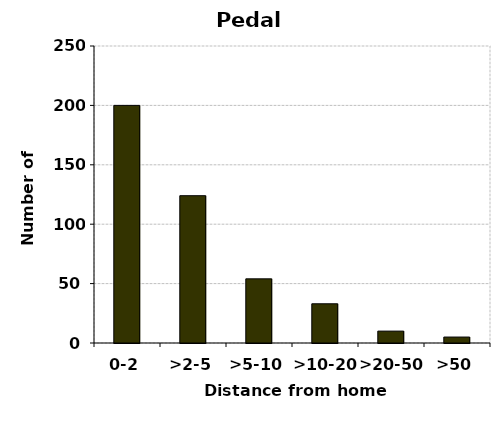
| Category | Pedal cycles |
|---|---|
| 0-2 | 200 |
| >2-5 | 124 |
| >5-10 | 54 |
| >10-20 | 33 |
| >20-50 | 10 |
| >50 | 5 |